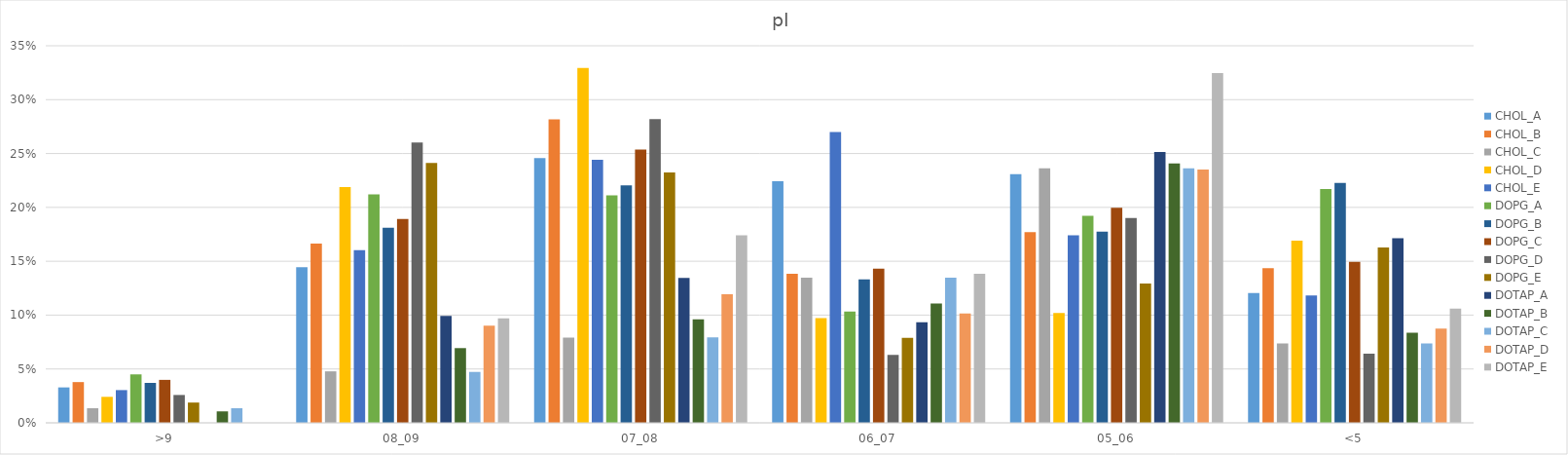
| Category | CHOL_A | CHOL_B | CHOL_C | CHOL_D | CHOL_E | DOPG_A | DOPG_B | DOPG_C | DOPG_D | DOPG_E | DOTAP_A | DOTAP_B | DOTAP_C | DOTAP_D | DOTAP_E |
|---|---|---|---|---|---|---|---|---|---|---|---|---|---|---|---|
| >9 | 0.033 | 0.038 | 0.014 | 0.024 | 0.03 | 0.045 | 0.037 | 0.04 | 0.026 | 0.019 | 0 | 0.011 | 0.014 | 0 | 0 |
| 08_09 | 0.144 | 0.166 | 0.048 | 0.219 | 0.16 | 0.212 | 0.181 | 0.189 | 0.26 | 0.241 | 0.099 | 0.069 | 0.047 | 0.09 | 0.097 |
| 07_08 | 0.246 | 0.282 | 0.079 | 0.329 | 0.244 | 0.211 | 0.22 | 0.254 | 0.282 | 0.232 | 0.135 | 0.096 | 0.079 | 0.119 | 0.174 |
| 06_07 | 0.224 | 0.138 | 0.135 | 0.097 | 0.27 | 0.103 | 0.133 | 0.143 | 0.063 | 0.079 | 0.093 | 0.111 | 0.135 | 0.102 | 0.138 |
| 05_06 | 0.231 | 0.177 | 0.236 | 0.102 | 0.174 | 0.192 | 0.178 | 0.2 | 0.19 | 0.129 | 0.251 | 0.241 | 0.236 | 0.235 | 0.325 |
| <5 | 0.121 | 0.144 | 0.074 | 0.169 | 0.118 | 0.217 | 0.223 | 0.149 | 0.064 | 0.163 | 0.171 | 0.084 | 0.074 | 0.087 | 0.106 |